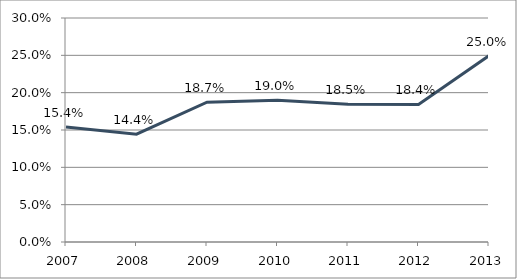
| Category | #REF! |
|---|---|
| 2007.0 | 0.154 |
| 2008.0 | 0.144 |
| 2009.0 | 0.187 |
| 2010.0 | 0.19 |
| 2011.0 | 0.185 |
| 2012.0 | 0.184 |
| 2013.0 | 0.25 |